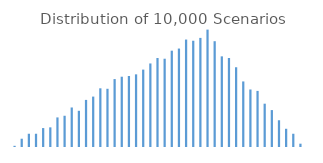
| Category | Series 0 |
|---|---|
| 0 | 5 |
| 1 | 35 |
| 2 | 56 |
| 3 | 56 |
| 4 | 80 |
| 5 | 83 |
| 6 | 125 |
| 7 | 132 |
| 8 | 167 |
| 9 | 153 |
| 10 | 199 |
| 11 | 213 |
| 12 | 248 |
| 13 | 246 |
| 14 | 287 |
| 15 | 297 |
| 16 | 300 |
| 17 | 307 |
| 18 | 327 |
| 19 | 353 |
| 20 | 376 |
| 21 | 373 |
| 22 | 407 |
| 23 | 416 |
| 24 | 454 |
| 25 | 449 |
| 26 | 461 |
| 27 | 496 |
| 28 | 447 |
| 29 | 383 |
| 30 | 376 |
| 31 | 337 |
| 32 | 277 |
| 33 | 243 |
| 34 | 237 |
| 35 | 183 |
| 36 | 156 |
| 37 | 113 |
| 38 | 77 |
| 39 | 56 |
| 40 | 14 |